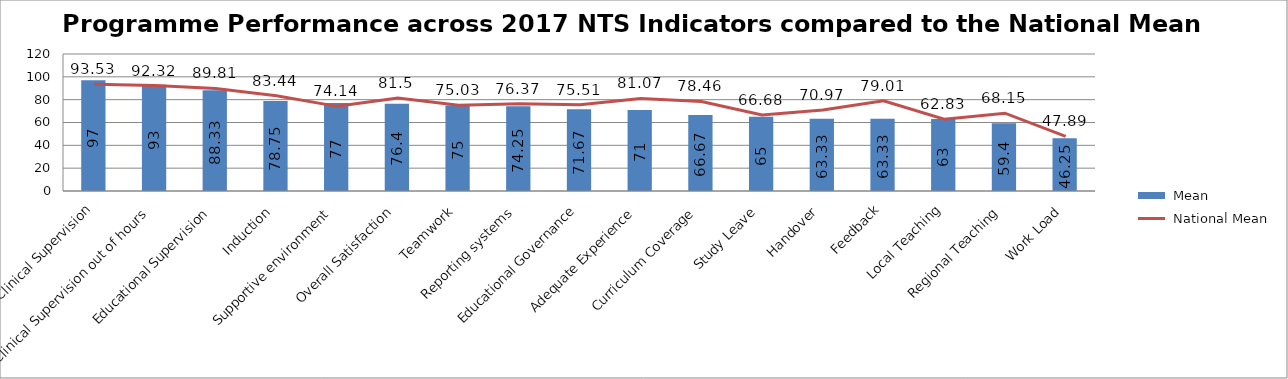
| Category |  Mean |
|---|---|
| Clinical Supervision | 97 |
| Clinical Supervision out of hours | 93 |
| Educational Supervision | 88.33 |
| Induction | 78.75 |
| Supportive environment | 77 |
| Overall Satisfaction | 76.4 |
| Teamwork | 75 |
| Reporting systems | 74.25 |
| Educational Governance | 71.67 |
| Adequate Experience | 71 |
| Curriculum Coverage | 66.67 |
| Study Leave | 65 |
| Handover | 63.33 |
| Feedback | 63.33 |
| Local Teaching | 63 |
| Regional Teaching | 59.4 |
| Work Load | 46.25 |